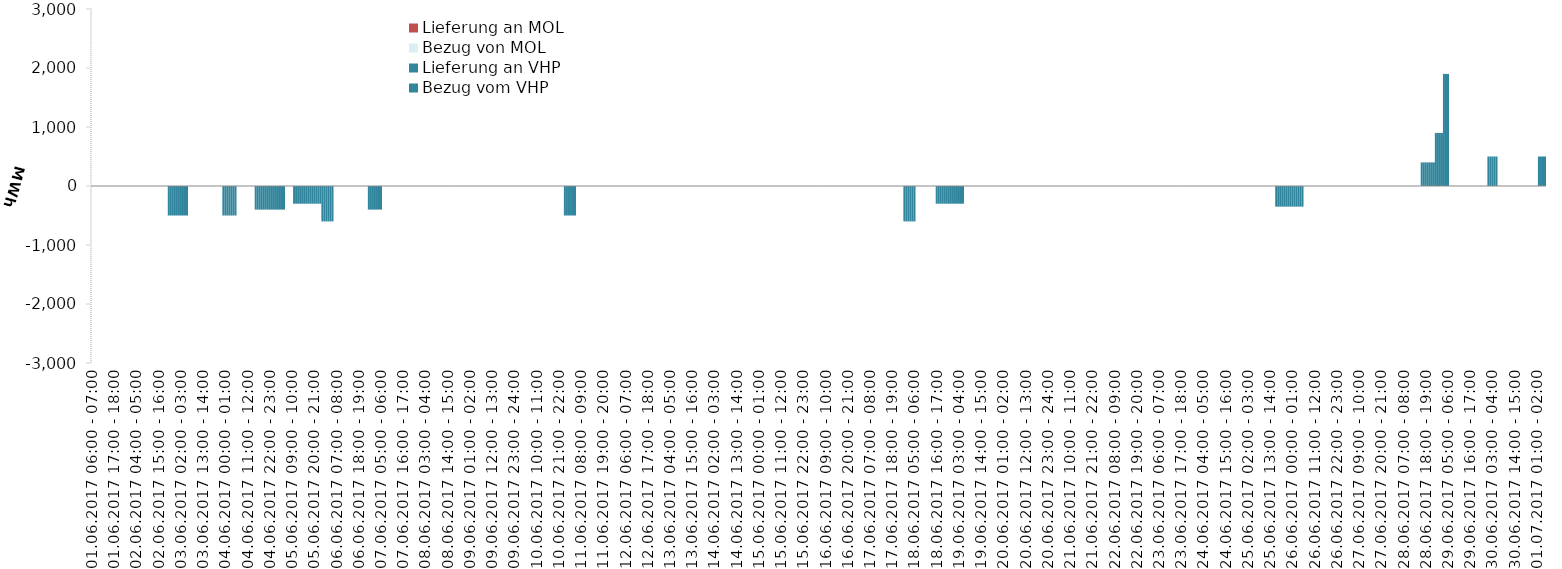
| Category | Bezug vom VHP | Lieferung an VHP | Bezug von MOL | Lieferung an MOL |
|---|---|---|---|---|
| 01.06.2017 06:00 - 07:00 | 0 | 0 | 0 | 0 |
| 01.06.2017 07:00 - 08:00 | 0 | 0 | 0 | 0 |
| 01.06.2017 08:00 - 09:00 | 0 | 0 | 0 | 0 |
| 01.06.2017 09:00 - 10:00 | 0 | 0 | 0 | 0 |
| 01.06.2017 10:00 - 11:00 | 0 | 0 | 0 | 0 |
| 01.06.2017 11:00 - 12:00 | 0 | 0 | 0 | 0 |
| 01.06.2017 12:00 - 13:00 | 0 | 0 | 0 | 0 |
| 01.06.2017 13:00 - 14:00 | 0 | 0 | 0 | 0 |
| 01.06.2017 14:00 - 15:00 | 0 | 0 | 0 | 0 |
| 01.06.2017 15:00 - 16:00 | 0 | 0 | 0 | 0 |
| 01.06.2017 16:00 - 17:00 | 0 | 0 | 0 | 0 |
| 01.06.2017 17:00 - 18:00 | 0 | 0 | 0 | 0 |
| 01.06.2017 18:00 - 19:00 | 0 | 0 | 0 | 0 |
| 01.06.2017 19:00 - 20:00 | 0 | 0 | 0 | 0 |
| 01.06.2017 20:00 - 21:00 | 0 | 0 | 0 | 0 |
| 01.06.2017 21:00 - 22:00 | 0 | 0 | 0 | 0 |
| 01.06.2017 22:00 - 23:00 | 0 | 0 | 0 | 0 |
| 01.06.2017 23:00 - 24:00 | 0 | 0 | 0 | 0 |
| 02.06.2017 00:00 - 01:00 | 0 | 0 | 0 | 0 |
| 02.06.2017 01:00 - 02:00 | 0 | 0 | 0 | 0 |
| 02.06.2017 02:00 - 03:00 | 0 | 0 | 0 | 0 |
| 02.06.2017 03:00 - 04:00 | 0 | 0 | 0 | 0 |
| 02.06.2017 04:00 - 05:00 | 0 | 0 | 0 | 0 |
| 02.06.2017 05:00 - 06:00 | 0 | 0 | 0 | 0 |
| 02.06.2017 06:00 - 07:00 | 0 | 0 | 0 | 0 |
| 02.06.2017 07:00 - 08:00 | 0 | 0 | 0 | 0 |
| 02.06.2017 08:00 - 09:00 | 0 | 0 | 0 | 0 |
| 02.06.2017 09:00 - 10:00 | 0 | 0 | 0 | 0 |
| 02.06.2017 10:00 - 11:00 | 0 | 0 | 0 | 0 |
| 02.06.2017 11:00 - 12:00 | 0 | 0 | 0 | 0 |
| 02.06.2017 12:00 - 13:00 | 0 | 0 | 0 | 0 |
| 02.06.2017 13:00 - 14:00 | 0 | 0 | 0 | 0 |
| 02.06.2017 14:00 - 15:00 | 0 | 0 | 0 | 0 |
| 02.06.2017 15:00 - 16:00 | 0 | 0 | 0 | 0 |
| 02.06.2017 16:00 - 17:00 | 0 | 0 | 0 | 0 |
| 02.06.2017 17:00 - 18:00 | 0 | 0 | 0 | 0 |
| 02.06.2017 18:00 - 19:00 | 0 | 0 | 0 | 0 |
| 02.06.2017 19:00 - 20:00 | 0 | 0 | 0 | 0 |
| 02.06.2017 20:00 - 21:00 | 0 | -500 | 0 | 0 |
| 02.06.2017 21:00 - 22:00 | 0 | -500 | 0 | 0 |
| 02.06.2017 22:00 - 23:00 | 0 | -500 | 0 | 0 |
| 02.06.2017 23:00 - 24:00 | 0 | -500 | 0 | 0 |
| 03.06.2017 00:00 - 01:00 | 0 | -500 | 0 | 0 |
| 03.06.2017 01:00 - 02:00 | 0 | -500 | 0 | 0 |
| 03.06.2017 02:00 - 03:00 | 0 | -500 | 0 | 0 |
| 03.06.2017 03:00 - 04:00 | 0 | -500 | 0 | 0 |
| 03.06.2017 04:00 - 05:00 | 0 | -500 | 0 | 0 |
| 03.06.2017 05:00 - 06:00 | 0 | -500 | 0 | 0 |
| 03.06.2017 06:00 - 07:00 | 0 | 0 | 0 | 0 |
| 03.06.2017 07:00 - 08:00 | 0 | 0 | 0 | 0 |
| 03.06.2017 08:00 - 09:00 | 0 | 0 | 0 | 0 |
| 03.06.2017 09:00 - 10:00 | 0 | 0 | 0 | 0 |
| 03.06.2017 10:00 - 11:00 | 0 | 0 | 0 | 0 |
| 03.06.2017 11:00 - 12:00 | 0 | 0 | 0 | 0 |
| 03.06.2017 12:00 - 13:00 | 0 | 0 | 0 | 0 |
| 03.06.2017 13:00 - 14:00 | 0 | 0 | 0 | 0 |
| 03.06.2017 14:00 - 15:00 | 0 | 0 | 0 | 0 |
| 03.06.2017 15:00 - 16:00 | 0 | 0 | 0 | 0 |
| 03.06.2017 16:00 - 17:00 | 0 | 0 | 0 | 0 |
| 03.06.2017 17:00 - 18:00 | 0 | 0 | 0 | 0 |
| 03.06.2017 18:00 - 19:00 | 0 | 0 | 0 | 0 |
| 03.06.2017 19:00 - 20:00 | 0 | 0 | 0 | 0 |
| 03.06.2017 20:00 - 21:00 | 0 | 0 | 0 | 0 |
| 03.06.2017 21:00 - 22:00 | 0 | 0 | 0 | 0 |
| 03.06.2017 22:00 - 23:00 | 0 | 0 | 0 | 0 |
| 03.06.2017 23:00 - 24:00 | 0 | -500 | 0 | 0 |
| 04.06.2017 00:00 - 01:00 | 0 | -500 | 0 | 0 |
| 04.06.2017 01:00 - 02:00 | 0 | -500 | 0 | 0 |
| 04.06.2017 02:00 - 03:00 | 0 | -500 | 0 | 0 |
| 04.06.2017 03:00 - 04:00 | 0 | -500 | 0 | 0 |
| 04.06.2017 04:00 - 05:00 | 0 | -500 | 0 | 0 |
| 04.06.2017 05:00 - 06:00 | 0 | -500 | 0 | 0 |
| 04.06.2017 06:00 - 07:00 | 0 | 0 | 0 | 0 |
| 04.06.2017 07:00 - 08:00 | 0 | 0 | 0 | 0 |
| 04.06.2017 08:00 - 09:00 | 0 | 0 | 0 | 0 |
| 04.06.2017 09:00 - 10:00 | 0 | 0 | 0 | 0 |
| 04.06.2017 10:00 - 11:00 | 0 | 0 | 0 | 0 |
| 04.06.2017 11:00 - 12:00 | 0 | 0 | 0 | 0 |
| 04.06.2017 12:00 - 13:00 | 0 | 0 | 0 | 0 |
| 04.06.2017 13:00 - 14:00 | 0 | 0 | 0 | 0 |
| 04.06.2017 14:00 - 15:00 | 0 | 0 | 0 | 0 |
| 04.06.2017 15:00 - 16:00 | 0 | -400 | 0 | 0 |
| 04.06.2017 16:00 - 17:00 | 0 | -400 | 0 | 0 |
| 04.06.2017 17:00 - 18:00 | 0 | -400 | 0 | 0 |
| 04.06.2017 18:00 - 19:00 | 0 | -400 | 0 | 0 |
| 04.06.2017 19:00 - 20:00 | 0 | -400 | 0 | 0 |
| 04.06.2017 20:00 - 21:00 | 0 | -400 | 0 | 0 |
| 04.06.2017 21:00 - 22:00 | 0 | -400 | 0 | 0 |
| 04.06.2017 22:00 - 23:00 | 0 | -400 | 0 | 0 |
| 04.06.2017 23:00 - 24:00 | 0 | -400 | 0 | 0 |
| 05.06.2017 00:00 - 01:00 | 0 | -400 | 0 | 0 |
| 05.06.2017 01:00 - 02:00 | 0 | -400 | 0 | 0 |
| 05.06.2017 02:00 - 03:00 | 0 | -400 | 0 | 0 |
| 05.06.2017 03:00 - 04:00 | 0 | -400 | 0 | 0 |
| 05.06.2017 04:00 - 05:00 | 0 | -400 | 0 | 0 |
| 05.06.2017 05:00 - 06:00 | 0 | -400 | 0 | 0 |
| 05.06.2017 06:00 - 07:00 | 0 | 0 | 0 | 0 |
| 05.06.2017 07:00 - 08:00 | 0 | 0 | 0 | 0 |
| 05.06.2017 08:00 - 09:00 | 0 | 0 | 0 | 0 |
| 05.06.2017 09:00 - 10:00 | 0 | 0 | 0 | 0 |
| 05.06.2017 10:00 - 11:00 | 0 | -300 | 0 | 0 |
| 05.06.2017 11:00 - 12:00 | 0 | -300 | 0 | 0 |
| 05.06.2017 12:00 - 13:00 | 0 | -300 | 0 | 0 |
| 05.06.2017 13:00 - 14:00 | 0 | -300 | 0 | 0 |
| 05.06.2017 14:00 - 15:00 | 0 | -300 | 0 | 0 |
| 05.06.2017 15:00 - 16:00 | 0 | -300 | 0 | 0 |
| 05.06.2017 16:00 - 17:00 | 0 | -300 | 0 | 0 |
| 05.06.2017 17:00 - 18:00 | 0 | -300 | 0 | 0 |
| 05.06.2017 18:00 - 19:00 | 0 | -300 | 0 | 0 |
| 05.06.2017 19:00 - 20:00 | 0 | -300 | 0 | 0 |
| 05.06.2017 20:00 - 21:00 | 0 | -300 | 0 | 0 |
| 05.06.2017 21:00 - 22:00 | 0 | -300 | 0 | 0 |
| 05.06.2017 22:00 - 23:00 | 0 | -300 | 0 | 0 |
| 05.06.2017 23:00 - 24:00 | 0 | -300 | 0 | 0 |
| 06.06.2017 00:00 - 01:00 | 0 | -600 | 0 | 0 |
| 06.06.2017 01:00 - 02:00 | 0 | -600 | 0 | 0 |
| 06.06.2017 02:00 - 03:00 | 0 | -600 | 0 | 0 |
| 06.06.2017 03:00 - 04:00 | 0 | -600 | 0 | 0 |
| 06.06.2017 04:00 - 05:00 | 0 | -600 | 0 | 0 |
| 06.06.2017 05:00 - 06:00 | 0 | -600 | 0 | 0 |
| 06.06.2017 06:00 - 07:00 | 0 | 0 | 0 | 0 |
| 06.06.2017 07:00 - 08:00 | 0 | 0 | 0 | 0 |
| 06.06.2017 08:00 - 09:00 | 0 | 0 | 0 | 0 |
| 06.06.2017 09:00 - 10:00 | 0 | 0 | 0 | 0 |
| 06.06.2017 10:00 - 11:00 | 0 | 0 | 0 | 0 |
| 06.06.2017 11:00 - 12:00 | 0 | 0 | 0 | 0 |
| 06.06.2017 12:00 - 13:00 | 0 | 0 | 0 | 0 |
| 06.06.2017 13:00 - 14:00 | 0 | 0 | 0 | 0 |
| 06.06.2017 14:00 - 15:00 | 0 | 0 | 0 | 0 |
| 06.06.2017 15:00 - 16:00 | 0 | 0 | 0 | 0 |
| 06.06.2017 16:00 - 17:00 | 0 | 0 | 0 | 0 |
| 06.06.2017 17:00 - 18:00 | 0 | 0 | 0 | 0 |
| 06.06.2017 18:00 - 19:00 | 0 | 0 | 0 | 0 |
| 06.06.2017 19:00 - 20:00 | 0 | 0 | 0 | 0 |
| 06.06.2017 20:00 - 21:00 | 0 | 0 | 0 | 0 |
| 06.06.2017 21:00 - 22:00 | 0 | 0 | 0 | 0 |
| 06.06.2017 22:00 - 23:00 | 0 | 0 | 0 | 0 |
| 06.06.2017 23:00 - 24:00 | 0 | -400 | 0 | 0 |
| 07.06.2017 00:00 - 01:00 | 0 | -400 | 0 | 0 |
| 07.06.2017 01:00 - 02:00 | 0 | -400 | 0 | 0 |
| 07.06.2017 02:00 - 03:00 | 0 | -400 | 0 | 0 |
| 07.06.2017 03:00 - 04:00 | 0 | -400 | 0 | 0 |
| 07.06.2017 04:00 - 05:00 | 0 | -400 | 0 | 0 |
| 07.06.2017 05:00 - 06:00 | 0 | -400 | 0 | 0 |
| 07.06.2017 06:00 - 07:00 | 0 | 0 | 0 | 0 |
| 07.06.2017 07:00 - 08:00 | 0 | 0 | 0 | 0 |
| 07.06.2017 08:00 - 09:00 | 0 | 0 | 0 | 0 |
| 07.06.2017 09:00 - 10:00 | 0 | 0 | 0 | 0 |
| 07.06.2017 10:00 - 11:00 | 0 | 0 | 0 | 0 |
| 07.06.2017 11:00 - 12:00 | 0 | 0 | 0 | 0 |
| 07.06.2017 12:00 - 13:00 | 0 | 0 | 0 | 0 |
| 07.06.2017 13:00 - 14:00 | 0 | 0 | 0 | 0 |
| 07.06.2017 14:00 - 15:00 | 0 | 0 | 0 | 0 |
| 07.06.2017 15:00 - 16:00 | 0 | 0 | 0 | 0 |
| 07.06.2017 16:00 - 17:00 | 0 | 0 | 0 | 0 |
| 07.06.2017 17:00 - 18:00 | 0 | 0 | 0 | 0 |
| 07.06.2017 18:00 - 19:00 | 0 | 0 | 0 | 0 |
| 07.06.2017 19:00 - 20:00 | 0 | 0 | 0 | 0 |
| 07.06.2017 20:00 - 21:00 | 0 | 0 | 0 | 0 |
| 07.06.2017 21:00 - 22:00 | 0 | 0 | 0 | 0 |
| 07.06.2017 22:00 - 23:00 | 0 | 0 | 0 | 0 |
| 07.06.2017 23:00 - 24:00 | 0 | 0 | 0 | 0 |
| 08.06.2017 00:00 - 01:00 | 0 | 0 | 0 | 0 |
| 08.06.2017 01:00 - 02:00 | 0 | 0 | 0 | 0 |
| 08.06.2017 02:00 - 03:00 | 0 | 0 | 0 | 0 |
| 08.06.2017 03:00 - 04:00 | 0 | 0 | 0 | 0 |
| 08.06.2017 04:00 - 05:00 | 0 | 0 | 0 | 0 |
| 08.06.2017 05:00 - 06:00 | 0 | 0 | 0 | 0 |
| 08.06.2017 06:00 - 07:00 | 0 | 0 | 0 | 0 |
| 08.06.2017 07:00 - 08:00 | 0 | 0 | 0 | 0 |
| 08.06.2017 08:00 - 09:00 | 0 | 0 | 0 | 0 |
| 08.06.2017 09:00 - 10:00 | 0 | 0 | 0 | 0 |
| 08.06.2017 10:00 - 11:00 | 0 | 0 | 0 | 0 |
| 08.06.2017 11:00 - 12:00 | 0 | 0 | 0 | 0 |
| 08.06.2017 12:00 - 13:00 | 0 | 0 | 0 | 0 |
| 08.06.2017 13:00 - 14:00 | 0 | 0 | 0 | 0 |
| 08.06.2017 14:00 - 15:00 | 0 | 0 | 0 | 0 |
| 08.06.2017 15:00 - 16:00 | 0 | 0 | 0 | 0 |
| 08.06.2017 16:00 - 17:00 | 0 | 0 | 0 | 0 |
| 08.06.2017 17:00 - 18:00 | 0 | 0 | 0 | 0 |
| 08.06.2017 18:00 - 19:00 | 0 | 0 | 0 | 0 |
| 08.06.2017 19:00 - 20:00 | 0 | 0 | 0 | 0 |
| 08.06.2017 20:00 - 21:00 | 0 | 0 | 0 | 0 |
| 08.06.2017 21:00 - 22:00 | 0 | 0 | 0 | 0 |
| 08.06.2017 22:00 - 23:00 | 0 | 0 | 0 | 0 |
| 08.06.2017 23:00 - 24:00 | 0 | 0 | 0 | 0 |
| 09.06.2017 00:00 - 01:00 | 0 | 0 | 0 | 0 |
| 09.06.2017 01:00 - 02:00 | 0 | 0 | 0 | 0 |
| 09.06.2017 02:00 - 03:00 | 0 | 0 | 0 | 0 |
| 09.06.2017 03:00 - 04:00 | 0 | 0 | 0 | 0 |
| 09.06.2017 04:00 - 05:00 | 0 | 0 | 0 | 0 |
| 09.06.2017 05:00 - 06:00 | 0 | 0 | 0 | 0 |
| 09.06.2017 06:00 - 07:00 | 0 | 0 | 0 | 0 |
| 09.06.2017 07:00 - 08:00 | 0 | 0 | 0 | 0 |
| 09.06.2017 08:00 - 09:00 | 0 | 0 | 0 | 0 |
| 09.06.2017 09:00 - 10:00 | 0 | 0 | 0 | 0 |
| 09.06.2017 10:00 - 11:00 | 0 | 0 | 0 | 0 |
| 09.06.2017 11:00 - 12:00 | 0 | 0 | 0 | 0 |
| 09.06.2017 12:00 - 13:00 | 0 | 0 | 0 | 0 |
| 09.06.2017 13:00 - 14:00 | 0 | 0 | 0 | 0 |
| 09.06.2017 14:00 - 15:00 | 0 | 0 | 0 | 0 |
| 09.06.2017 15:00 - 16:00 | 0 | 0 | 0 | 0 |
| 09.06.2017 16:00 - 17:00 | 0 | 0 | 0 | 0 |
| 09.06.2017 17:00 - 18:00 | 0 | 0 | 0 | 0 |
| 09.06.2017 18:00 - 19:00 | 0 | 0 | 0 | 0 |
| 09.06.2017 19:00 - 20:00 | 0 | 0 | 0 | 0 |
| 09.06.2017 20:00 - 21:00 | 0 | 0 | 0 | 0 |
| 09.06.2017 21:00 - 22:00 | 0 | 0 | 0 | 0 |
| 09.06.2017 22:00 - 23:00 | 0 | 0 | 0 | 0 |
| 09.06.2017 23:00 - 24:00 | 0 | 0 | 0 | 0 |
| 10.06.2017 00:00 - 01:00 | 0 | 0 | 0 | 0 |
| 10.06.2017 01:00 - 02:00 | 0 | 0 | 0 | 0 |
| 10.06.2017 02:00 - 03:00 | 0 | 0 | 0 | 0 |
| 10.06.2017 03:00 - 04:00 | 0 | 0 | 0 | 0 |
| 10.06.2017 04:00 - 05:00 | 0 | 0 | 0 | 0 |
| 10.06.2017 05:00 - 06:00 | 0 | 0 | 0 | 0 |
| 10.06.2017 06:00 - 07:00 | 0 | 0 | 0 | 0 |
| 10.06.2017 07:00 - 08:00 | 0 | 0 | 0 | 0 |
| 10.06.2017 08:00 - 09:00 | 0 | 0 | 0 | 0 |
| 10.06.2017 09:00 - 10:00 | 0 | 0 | 0 | 0 |
| 10.06.2017 10:00 - 11:00 | 0 | 0 | 0 | 0 |
| 10.06.2017 11:00 - 12:00 | 0 | 0 | 0 | 0 |
| 10.06.2017 12:00 - 13:00 | 0 | 0 | 0 | 0 |
| 10.06.2017 13:00 - 14:00 | 0 | 0 | 0 | 0 |
| 10.06.2017 14:00 - 15:00 | 0 | 0 | 0 | 0 |
| 10.06.2017 15:00 - 16:00 | 0 | 0 | 0 | 0 |
| 10.06.2017 16:00 - 17:00 | 0 | 0 | 0 | 0 |
| 10.06.2017 17:00 - 18:00 | 0 | 0 | 0 | 0 |
| 10.06.2017 18:00 - 19:00 | 0 | 0 | 0 | 0 |
| 10.06.2017 19:00 - 20:00 | 0 | 0 | 0 | 0 |
| 10.06.2017 20:00 - 21:00 | 0 | 0 | 0 | 0 |
| 10.06.2017 21:00 - 22:00 | 0 | 0 | 0 | 0 |
| 10.06.2017 22:00 - 23:00 | 0 | 0 | 0 | 0 |
| 10.06.2017 23:00 - 24:00 | 0 | 0 | 0 | 0 |
| 11.06.2017 00:00 - 01:00 | 0 | -500 | 0 | 0 |
| 11.06.2017 01:00 - 02:00 | 0 | -500 | 0 | 0 |
| 11.06.2017 02:00 - 03:00 | 0 | -500 | 0 | 0 |
| 11.06.2017 03:00 - 04:00 | 0 | -500 | 0 | 0 |
| 11.06.2017 04:00 - 05:00 | 0 | -500 | 0 | 0 |
| 11.06.2017 05:00 - 06:00 | 0 | -500 | 0 | 0 |
| 11.06.2017 06:00 - 07:00 | 0 | 0 | 0 | 0 |
| 11.06.2017 07:00 - 08:00 | 0 | 0 | 0 | 0 |
| 11.06.2017 08:00 - 09:00 | 0 | 0 | 0 | 0 |
| 11.06.2017 09:00 - 10:00 | 0 | 0 | 0 | 0 |
| 11.06.2017 10:00 - 11:00 | 0 | 0 | 0 | 0 |
| 11.06.2017 11:00 - 12:00 | 0 | 0 | 0 | 0 |
| 11.06.2017 12:00 - 13:00 | 0 | 0 | 0 | 0 |
| 11.06.2017 13:00 - 14:00 | 0 | 0 | 0 | 0 |
| 11.06.2017 14:00 - 15:00 | 0 | 0 | 0 | 0 |
| 11.06.2017 15:00 - 16:00 | 0 | 0 | 0 | 0 |
| 11.06.2017 16:00 - 17:00 | 0 | 0 | 0 | 0 |
| 11.06.2017 17:00 - 18:00 | 0 | 0 | 0 | 0 |
| 11.06.2017 18:00 - 19:00 | 0 | 0 | 0 | 0 |
| 11.06.2017 19:00 - 20:00 | 0 | 0 | 0 | 0 |
| 11.06.2017 20:00 - 21:00 | 0 | 0 | 0 | 0 |
| 11.06.2017 21:00 - 22:00 | 0 | 0 | 0 | 0 |
| 11.06.2017 22:00 - 23:00 | 0 | 0 | 0 | 0 |
| 11.06.2017 23:00 - 24:00 | 0 | 0 | 0 | 0 |
| 12.06.2017 00:00 - 01:00 | 0 | 0 | 0 | 0 |
| 12.06.2017 01:00 - 02:00 | 0 | 0 | 0 | 0 |
| 12.06.2017 02:00 - 03:00 | 0 | 0 | 0 | 0 |
| 12.06.2017 03:00 - 04:00 | 0 | 0 | 0 | 0 |
| 12.06.2017 04:00 - 05:00 | 0 | 0 | 0 | 0 |
| 12.06.2017 05:00 - 06:00 | 0 | 0 | 0 | 0 |
| 12.06.2017 06:00 - 07:00 | 0 | 0 | 0 | 0 |
| 12.06.2017 07:00 - 08:00 | 0 | 0 | 0 | 0 |
| 12.06.2017 08:00 - 09:00 | 0 | 0 | 0 | 0 |
| 12.06.2017 09:00 - 10:00 | 0 | 0 | 0 | 0 |
| 12.06.2017 10:00 - 11:00 | 0 | 0 | 0 | 0 |
| 12.06.2017 11:00 - 12:00 | 0 | 0 | 0 | 0 |
| 12.06.2017 12:00 - 13:00 | 0 | 0 | 0 | 0 |
| 12.06.2017 13:00 - 14:00 | 0 | 0 | 0 | 0 |
| 12.06.2017 14:00 - 15:00 | 0 | 0 | 0 | 0 |
| 12.06.2017 15:00 - 16:00 | 0 | 0 | 0 | 0 |
| 12.06.2017 16:00 - 17:00 | 0 | 0 | 0 | 0 |
| 12.06.2017 17:00 - 18:00 | 0 | 0 | 0 | 0 |
| 12.06.2017 18:00 - 19:00 | 0 | 0 | 0 | 0 |
| 12.06.2017 19:00 - 20:00 | 0 | 0 | 0 | 0 |
| 12.06.2017 20:00 - 21:00 | 0 | 0 | 0 | 0 |
| 12.06.2017 21:00 - 22:00 | 0 | 0 | 0 | 0 |
| 12.06.2017 22:00 - 23:00 | 0 | 0 | 0 | 0 |
| 12.06.2017 23:00 - 24:00 | 0 | 0 | 0 | 0 |
| 13.06.2017 00:00 - 01:00 | 0 | 0 | 0 | 0 |
| 13.06.2017 01:00 - 02:00 | 0 | 0 | 0 | 0 |
| 13.06.2017 02:00 - 03:00 | 0 | 0 | 0 | 0 |
| 13.06.2017 03:00 - 04:00 | 0 | 0 | 0 | 0 |
| 13.06.2017 04:00 - 05:00 | 0 | 0 | 0 | 0 |
| 13.06.2017 05:00 - 06:00 | 0 | 0 | 0 | 0 |
| 13.06.2017 06:00 - 07:00 | 0 | 0 | 0 | 0 |
| 13.06.2017 07:00 - 08:00 | 0 | 0 | 0 | 0 |
| 13.06.2017 08:00 - 09:00 | 0 | 0 | 0 | 0 |
| 13.06.2017 09:00 - 10:00 | 0 | 0 | 0 | 0 |
| 13.06.2017 10:00 - 11:00 | 0 | 0 | 0 | 0 |
| 13.06.2017 11:00 - 12:00 | 0 | 0 | 0 | 0 |
| 13.06.2017 12:00 - 13:00 | 0 | 0 | 0 | 0 |
| 13.06.2017 13:00 - 14:00 | 0 | 0 | 0 | 0 |
| 13.06.2017 14:00 - 15:00 | 0 | 0 | 0 | 0 |
| 13.06.2017 15:00 - 16:00 | 0 | 0 | 0 | 0 |
| 13.06.2017 16:00 - 17:00 | 0 | 0 | 0 | 0 |
| 13.06.2017 17:00 - 18:00 | 0 | 0 | 0 | 0 |
| 13.06.2017 18:00 - 19:00 | 0 | 0 | 0 | 0 |
| 13.06.2017 19:00 - 20:00 | 0 | 0 | 0 | 0 |
| 13.06.2017 20:00 - 21:00 | 0 | 0 | 0 | 0 |
| 13.06.2017 21:00 - 22:00 | 0 | 0 | 0 | 0 |
| 13.06.2017 22:00 - 23:00 | 0 | 0 | 0 | 0 |
| 13.06.2017 23:00 - 24:00 | 0 | 0 | 0 | 0 |
| 14.06.2017 00:00 - 01:00 | 0 | 0 | 0 | 0 |
| 14.06.2017 01:00 - 02:00 | 0 | 0 | 0 | 0 |
| 14.06.2017 02:00 - 03:00 | 0 | 0 | 0 | 0 |
| 14.06.2017 03:00 - 04:00 | 0 | 0 | 0 | 0 |
| 14.06.2017 04:00 - 05:00 | 0 | 0 | 0 | 0 |
| 14.06.2017 05:00 - 06:00 | 0 | 0 | 0 | 0 |
| 14.06.2017 06:00 - 07:00 | 0 | 0 | 0 | 0 |
| 14.06.2017 07:00 - 08:00 | 0 | 0 | 0 | 0 |
| 14.06.2017 08:00 - 09:00 | 0 | 0 | 0 | 0 |
| 14.06.2017 09:00 - 10:00 | 0 | 0 | 0 | 0 |
| 14.06.2017 10:00 - 11:00 | 0 | 0 | 0 | 0 |
| 14.06.2017 11:00 - 12:00 | 0 | 0 | 0 | 0 |
| 14.06.2017 12:00 - 13:00 | 0 | 0 | 0 | 0 |
| 14.06.2017 13:00 - 14:00 | 0 | 0 | 0 | 0 |
| 14.06.2017 14:00 - 15:00 | 0 | 0 | 0 | 0 |
| 14.06.2017 15:00 - 16:00 | 0 | 0 | 0 | 0 |
| 14.06.2017 16:00 - 17:00 | 0 | 0 | 0 | 0 |
| 14.06.2017 17:00 - 18:00 | 0 | 0 | 0 | 0 |
| 14.06.2017 18:00 - 19:00 | 0 | 0 | 0 | 0 |
| 14.06.2017 19:00 - 20:00 | 0 | 0 | 0 | 0 |
| 14.06.2017 20:00 - 21:00 | 0 | 0 | 0 | 0 |
| 14.06.2017 21:00 - 22:00 | 0 | 0 | 0 | 0 |
| 14.06.2017 22:00 - 23:00 | 0 | 0 | 0 | 0 |
| 14.06.2017 23:00 - 24:00 | 0 | 0 | 0 | 0 |
| 15.06.2017 00:00 - 01:00 | 0 | 0 | 0 | 0 |
| 15.06.2017 01:00 - 02:00 | 0 | 0 | 0 | 0 |
| 15.06.2017 02:00 - 03:00 | 0 | 0 | 0 | 0 |
| 15.06.2017 03:00 - 04:00 | 0 | 0 | 0 | 0 |
| 15.06.2017 04:00 - 05:00 | 0 | 0 | 0 | 0 |
| 15.06.2017 05:00 - 06:00 | 0 | 0 | 0 | 0 |
| 15.06.2017 06:00 - 07:00 | 0 | 0 | 0 | 0 |
| 15.06.2017 07:00 - 08:00 | 0 | 0 | 0 | 0 |
| 15.06.2017 08:00 - 09:00 | 0 | 0 | 0 | 0 |
| 15.06.2017 09:00 - 10:00 | 0 | 0 | 0 | 0 |
| 15.06.2017 10:00 - 11:00 | 0 | 0 | 0 | 0 |
| 15.06.2017 11:00 - 12:00 | 0 | 0 | 0 | 0 |
| 15.06.2017 12:00 - 13:00 | 0 | 0 | 0 | 0 |
| 15.06.2017 13:00 - 14:00 | 0 | 0 | 0 | 0 |
| 15.06.2017 14:00 - 15:00 | 0 | 0 | 0 | 0 |
| 15.06.2017 15:00 - 16:00 | 0 | 0 | 0 | 0 |
| 15.06.2017 16:00 - 17:00 | 0 | 0 | 0 | 0 |
| 15.06.2017 17:00 - 18:00 | 0 | 0 | 0 | 0 |
| 15.06.2017 18:00 - 19:00 | 0 | 0 | 0 | 0 |
| 15.06.2017 19:00 - 20:00 | 0 | 0 | 0 | 0 |
| 15.06.2017 20:00 - 21:00 | 0 | 0 | 0 | 0 |
| 15.06.2017 21:00 - 22:00 | 0 | 0 | 0 | 0 |
| 15.06.2017 22:00 - 23:00 | 0 | 0 | 0 | 0 |
| 15.06.2017 23:00 - 24:00 | 0 | 0 | 0 | 0 |
| 16.06.2017 00:00 - 01:00 | 0 | 0 | 0 | 0 |
| 16.06.2017 01:00 - 02:00 | 0 | 0 | 0 | 0 |
| 16.06.2017 02:00 - 03:00 | 0 | 0 | 0 | 0 |
| 16.06.2017 03:00 - 04:00 | 0 | 0 | 0 | 0 |
| 16.06.2017 04:00 - 05:00 | 0 | 0 | 0 | 0 |
| 16.06.2017 05:00 - 06:00 | 0 | 0 | 0 | 0 |
| 16.06.2017 06:00 - 07:00 | 0 | 0 | 0 | 0 |
| 16.06.2017 07:00 - 08:00 | 0 | 0 | 0 | 0 |
| 16.06.2017 08:00 - 09:00 | 0 | 0 | 0 | 0 |
| 16.06.2017 09:00 - 10:00 | 0 | 0 | 0 | 0 |
| 16.06.2017 10:00 - 11:00 | 0 | 0 | 0 | 0 |
| 16.06.2017 11:00 - 12:00 | 0 | 0 | 0 | 0 |
| 16.06.2017 12:00 - 13:00 | 0 | 0 | 0 | 0 |
| 16.06.2017 13:00 - 14:00 | 0 | 0 | 0 | 0 |
| 16.06.2017 14:00 - 15:00 | 0 | 0 | 0 | 0 |
| 16.06.2017 15:00 - 16:00 | 0 | 0 | 0 | 0 |
| 16.06.2017 16:00 - 17:00 | 0 | 0 | 0 | 0 |
| 16.06.2017 17:00 - 18:00 | 0 | 0 | 0 | 0 |
| 16.06.2017 18:00 - 19:00 | 0 | 0 | 0 | 0 |
| 16.06.2017 19:00 - 20:00 | 0 | 0 | 0 | 0 |
| 16.06.2017 20:00 - 21:00 | 0 | 0 | 0 | 0 |
| 16.06.2017 21:00 - 22:00 | 0 | 0 | 0 | 0 |
| 16.06.2017 22:00 - 23:00 | 0 | 0 | 0 | 0 |
| 16.06.2017 23:00 - 24:00 | 0 | 0 | 0 | 0 |
| 17.06.2017 00:00 - 01:00 | 0 | 0 | 0 | 0 |
| 17.06.2017 01:00 - 02:00 | 0 | 0 | 0 | 0 |
| 17.06.2017 02:00 - 03:00 | 0 | 0 | 0 | 0 |
| 17.06.2017 03:00 - 04:00 | 0 | 0 | 0 | 0 |
| 17.06.2017 04:00 - 05:00 | 0 | 0 | 0 | 0 |
| 17.06.2017 05:00 - 06:00 | 0 | 0 | 0 | 0 |
| 17.06.2017 06:00 - 07:00 | 0 | 0 | 0 | 0 |
| 17.06.2017 07:00 - 08:00 | 0 | 0 | 0 | 0 |
| 17.06.2017 08:00 - 09:00 | 0 | 0 | 0 | 0 |
| 17.06.2017 09:00 - 10:00 | 0 | 0 | 0 | 0 |
| 17.06.2017 10:00 - 11:00 | 0 | 0 | 0 | 0 |
| 17.06.2017 11:00 - 12:00 | 0 | 0 | 0 | 0 |
| 17.06.2017 12:00 - 13:00 | 0 | 0 | 0 | 0 |
| 17.06.2017 13:00 - 14:00 | 0 | 0 | 0 | 0 |
| 17.06.2017 14:00 - 15:00 | 0 | 0 | 0 | 0 |
| 17.06.2017 15:00 - 16:00 | 0 | 0 | 0 | 0 |
| 17.06.2017 16:00 - 17:00 | 0 | 0 | 0 | 0 |
| 17.06.2017 17:00 - 18:00 | 0 | 0 | 0 | 0 |
| 17.06.2017 18:00 - 19:00 | 0 | 0 | 0 | 0 |
| 17.06.2017 19:00 - 20:00 | 0 | 0 | 0 | 0 |
| 17.06.2017 20:00 - 21:00 | 0 | 0 | 0 | 0 |
| 17.06.2017 21:00 - 22:00 | 0 | 0 | 0 | 0 |
| 17.06.2017 22:00 - 23:00 | 0 | 0 | 0 | 0 |
| 17.06.2017 23:00 - 24:00 | 0 | 0 | 0 | 0 |
| 18.06.2017 00:00 - 01:00 | 0 | -600 | 0 | 0 |
| 18.06.2017 01:00 - 02:00 | 0 | -600 | 0 | 0 |
| 18.06.2017 02:00 - 03:00 | 0 | -600 | 0 | 0 |
| 18.06.2017 03:00 - 04:00 | 0 | -600 | 0 | 0 |
| 18.06.2017 04:00 - 05:00 | 0 | -600 | 0 | 0 |
| 18.06.2017 05:00 - 06:00 | 0 | -600 | 0 | 0 |
| 18.06.2017 06:00 - 07:00 | 0 | 0 | 0 | 0 |
| 18.06.2017 07:00 - 08:00 | 0 | 0 | 0 | 0 |
| 18.06.2017 08:00 - 09:00 | 0 | 0 | 0 | 0 |
| 18.06.2017 09:00 - 10:00 | 0 | 0 | 0 | 0 |
| 18.06.2017 10:00 - 11:00 | 0 | 0 | 0 | 0 |
| 18.06.2017 11:00 - 12:00 | 0 | 0 | 0 | 0 |
| 18.06.2017 12:00 - 13:00 | 0 | 0 | 0 | 0 |
| 18.06.2017 13:00 - 14:00 | 0 | 0 | 0 | 0 |
| 18.06.2017 14:00 - 15:00 | 0 | 0 | 0 | 0 |
| 18.06.2017 15:00 - 16:00 | 0 | 0 | 0 | 0 |
| 18.06.2017 16:00 - 17:00 | 0 | -300 | 0 | 0 |
| 18.06.2017 17:00 - 18:00 | 0 | -300 | 0 | 0 |
| 18.06.2017 18:00 - 19:00 | 0 | -300 | 0 | 0 |
| 18.06.2017 19:00 - 20:00 | 0 | -300 | 0 | 0 |
| 18.06.2017 20:00 - 21:00 | 0 | -300 | 0 | 0 |
| 18.06.2017 21:00 - 22:00 | 0 | -300 | 0 | 0 |
| 18.06.2017 22:00 - 23:00 | 0 | -300 | 0 | 0 |
| 18.06.2017 23:00 - 24:00 | 0 | -300 | 0 | 0 |
| 19.06.2017 00:00 - 01:00 | 0 | -300 | 0 | 0 |
| 19.06.2017 01:00 - 02:00 | 0 | -300 | 0 | 0 |
| 19.06.2017 02:00 - 03:00 | 0 | -300 | 0 | 0 |
| 19.06.2017 03:00 - 04:00 | 0 | -300 | 0 | 0 |
| 19.06.2017 04:00 - 05:00 | 0 | -300 | 0 | 0 |
| 19.06.2017 05:00 - 06:00 | 0 | -300 | 0 | 0 |
| 19.06.2017 06:00 - 07:00 | 0 | 0 | 0 | 0 |
| 19.06.2017 07:00 - 08:00 | 0 | 0 | 0 | 0 |
| 19.06.2017 08:00 - 09:00 | 0 | 0 | 0 | 0 |
| 19.06.2017 09:00 - 10:00 | 0 | 0 | 0 | 0 |
| 19.06.2017 10:00 - 11:00 | 0 | 0 | 0 | 0 |
| 19.06.2017 11:00 - 12:00 | 0 | 0 | 0 | 0 |
| 19.06.2017 12:00 - 13:00 | 0 | 0 | 0 | 0 |
| 19.06.2017 13:00 - 14:00 | 0 | 0 | 0 | 0 |
| 19.06.2017 14:00 - 15:00 | 0 | 0 | 0 | 0 |
| 19.06.2017 15:00 - 16:00 | 0 | 0 | 0 | 0 |
| 19.06.2017 16:00 - 17:00 | 0 | 0 | 0 | 0 |
| 19.06.2017 17:00 - 18:00 | 0 | 0 | 0 | 0 |
| 19.06.2017 18:00 - 19:00 | 0 | 0 | 0 | 0 |
| 19.06.2017 19:00 - 20:00 | 0 | 0 | 0 | 0 |
| 19.06.2017 20:00 - 21:00 | 0 | 0 | 0 | 0 |
| 19.06.2017 21:00 - 22:00 | 0 | 0 | 0 | 0 |
| 19.06.2017 22:00 - 23:00 | 0 | 0 | 0 | 0 |
| 19.06.2017 23:00 - 24:00 | 0 | 0 | 0 | 0 |
| 20.06.2017 00:00 - 01:00 | 0 | 0 | 0 | 0 |
| 20.06.2017 01:00 - 02:00 | 0 | 0 | 0 | 0 |
| 20.06.2017 02:00 - 03:00 | 0 | 0 | 0 | 0 |
| 20.06.2017 03:00 - 04:00 | 0 | 0 | 0 | 0 |
| 20.06.2017 04:00 - 05:00 | 0 | 0 | 0 | 0 |
| 20.06.2017 05:00 - 06:00 | 0 | 0 | 0 | 0 |
| 20.06.2017 06:00 - 07:00 | 0 | 0 | 0 | 0 |
| 20.06.2017 07:00 - 08:00 | 0 | 0 | 0 | 0 |
| 20.06.2017 08:00 - 09:00 | 0 | 0 | 0 | 0 |
| 20.06.2017 09:00 - 10:00 | 0 | 0 | 0 | 0 |
| 20.06.2017 10:00 - 11:00 | 0 | 0 | 0 | 0 |
| 20.06.2017 11:00 - 12:00 | 0 | 0 | 0 | 0 |
| 20.06.2017 12:00 - 13:00 | 0 | 0 | 0 | 0 |
| 20.06.2017 13:00 - 14:00 | 0 | 0 | 0 | 0 |
| 20.06.2017 14:00 - 15:00 | 0 | 0 | 0 | 0 |
| 20.06.2017 15:00 - 16:00 | 0 | 0 | 0 | 0 |
| 20.06.2017 16:00 - 17:00 | 0 | 0 | 0 | 0 |
| 20.06.2017 17:00 - 18:00 | 0 | 0 | 0 | 0 |
| 20.06.2017 18:00 - 19:00 | 0 | 0 | 0 | 0 |
| 20.06.2017 19:00 - 20:00 | 0 | 0 | 0 | 0 |
| 20.06.2017 20:00 - 21:00 | 0 | 0 | 0 | 0 |
| 20.06.2017 21:00 - 22:00 | 0 | 0 | 0 | 0 |
| 20.06.2017 22:00 - 23:00 | 0 | 0 | 0 | 0 |
| 20.06.2017 23:00 - 24:00 | 0 | 0 | 0 | 0 |
| 21.06.2017 00:00 - 01:00 | 0 | 0 | 0 | 0 |
| 21.06.2017 01:00 - 02:00 | 0 | 0 | 0 | 0 |
| 21.06.2017 02:00 - 03:00 | 0 | 0 | 0 | 0 |
| 21.06.2017 03:00 - 04:00 | 0 | 0 | 0 | 0 |
| 21.06.2017 04:00 - 05:00 | 0 | 0 | 0 | 0 |
| 21.06.2017 05:00 - 06:00 | 0 | 0 | 0 | 0 |
| 21.06.2017 06:00 - 07:00 | 0 | 0 | 0 | 0 |
| 21.06.2017 07:00 - 08:00 | 0 | 0 | 0 | 0 |
| 21.06.2017 08:00 - 09:00 | 0 | 0 | 0 | 0 |
| 21.06.2017 09:00 - 10:00 | 0 | 0 | 0 | 0 |
| 21.06.2017 10:00 - 11:00 | 0 | 0 | 0 | 0 |
| 21.06.2017 11:00 - 12:00 | 0 | 0 | 0 | 0 |
| 21.06.2017 12:00 - 13:00 | 0 | 0 | 0 | 0 |
| 21.06.2017 13:00 - 14:00 | 0 | 0 | 0 | 0 |
| 21.06.2017 14:00 - 15:00 | 0 | 0 | 0 | 0 |
| 21.06.2017 15:00 - 16:00 | 0 | 0 | 0 | 0 |
| 21.06.2017 16:00 - 17:00 | 0 | 0 | 0 | 0 |
| 21.06.2017 17:00 - 18:00 | 0 | 0 | 0 | 0 |
| 21.06.2017 18:00 - 19:00 | 0 | 0 | 0 | 0 |
| 21.06.2017 19:00 - 20:00 | 0 | 0 | 0 | 0 |
| 21.06.2017 20:00 - 21:00 | 0 | 0 | 0 | 0 |
| 21.06.2017 21:00 - 22:00 | 0 | 0 | 0 | 0 |
| 21.06.2017 22:00 - 23:00 | 0 | 0 | 0 | 0 |
| 21.06.2017 23:00 - 24:00 | 0 | 0 | 0 | 0 |
| 22.06.2017 00:00 - 01:00 | 0 | 0 | 0 | 0 |
| 22.06.2017 01:00 - 02:00 | 0 | 0 | 0 | 0 |
| 22.06.2017 02:00 - 03:00 | 0 | 0 | 0 | 0 |
| 22.06.2017 03:00 - 04:00 | 0 | 0 | 0 | 0 |
| 22.06.2017 04:00 - 05:00 | 0 | 0 | 0 | 0 |
| 22.06.2017 05:00 - 06:00 | 0 | 0 | 0 | 0 |
| 22.06.2017 06:00 - 07:00 | 0 | 0 | 0 | 0 |
| 22.06.2017 07:00 - 08:00 | 0 | 0 | 0 | 0 |
| 22.06.2017 08:00 - 09:00 | 0 | 0 | 0 | 0 |
| 22.06.2017 09:00 - 10:00 | 0 | 0 | 0 | 0 |
| 22.06.2017 10:00 - 11:00 | 0 | 0 | 0 | 0 |
| 22.06.2017 11:00 - 12:00 | 0 | 0 | 0 | 0 |
| 22.06.2017 12:00 - 13:00 | 0 | 0 | 0 | 0 |
| 22.06.2017 13:00 - 14:00 | 0 | 0 | 0 | 0 |
| 22.06.2017 14:00 - 15:00 | 0 | 0 | 0 | 0 |
| 22.06.2017 15:00 - 16:00 | 0 | 0 | 0 | 0 |
| 22.06.2017 16:00 - 17:00 | 0 | 0 | 0 | 0 |
| 22.06.2017 17:00 - 18:00 | 0 | 0 | 0 | 0 |
| 22.06.2017 18:00 - 19:00 | 0 | 0 | 0 | 0 |
| 22.06.2017 19:00 - 20:00 | 0 | 0 | 0 | 0 |
| 22.06.2017 20:00 - 21:00 | 0 | 0 | 0 | 0 |
| 22.06.2017 21:00 - 22:00 | 0 | 0 | 0 | 0 |
| 22.06.2017 22:00 - 23:00 | 0 | 0 | 0 | 0 |
| 22.06.2017 23:00 - 24:00 | 0 | 0 | 0 | 0 |
| 23.06.2017 00:00 - 01:00 | 0 | 0 | 0 | 0 |
| 23.06.2017 01:00 - 02:00 | 0 | 0 | 0 | 0 |
| 23.06.2017 02:00 - 03:00 | 0 | 0 | 0 | 0 |
| 23.06.2017 03:00 - 04:00 | 0 | 0 | 0 | 0 |
| 23.06.2017 04:00 - 05:00 | 0 | 0 | 0 | 0 |
| 23.06.2017 05:00 - 06:00 | 0 | 0 | 0 | 0 |
| 23.06.2017 06:00 - 07:00 | 0 | 0 | 0 | 0 |
| 23.06.2017 07:00 - 08:00 | 0 | 0 | 0 | 0 |
| 23.06.2017 08:00 - 09:00 | 0 | 0 | 0 | 0 |
| 23.06.2017 09:00 - 10:00 | 0 | 0 | 0 | 0 |
| 23.06.2017 10:00 - 11:00 | 0 | 0 | 0 | 0 |
| 23.06.2017 11:00 - 12:00 | 0 | 0 | 0 | 0 |
| 23.06.2017 12:00 - 13:00 | 0 | 0 | 0 | 0 |
| 23.06.2017 13:00 - 14:00 | 0 | 0 | 0 | 0 |
| 23.06.2017 14:00 - 15:00 | 0 | 0 | 0 | 0 |
| 23.06.2017 15:00 - 16:00 | 0 | 0 | 0 | 0 |
| 23.06.2017 16:00 - 17:00 | 0 | 0 | 0 | 0 |
| 23.06.2017 17:00 - 18:00 | 0 | 0 | 0 | 0 |
| 23.06.2017 18:00 - 19:00 | 0 | 0 | 0 | 0 |
| 23.06.2017 19:00 - 20:00 | 0 | 0 | 0 | 0 |
| 23.06.2017 20:00 - 21:00 | 0 | 0 | 0 | 0 |
| 23.06.2017 21:00 - 22:00 | 0 | 0 | 0 | 0 |
| 23.06.2017 22:00 - 23:00 | 0 | 0 | 0 | 0 |
| 23.06.2017 23:00 - 24:00 | 0 | 0 | 0 | 0 |
| 24.06.2017 00:00 - 01:00 | 0 | 0 | 0 | 0 |
| 24.06.2017 01:00 - 02:00 | 0 | 0 | 0 | 0 |
| 24.06.2017 02:00 - 03:00 | 0 | 0 | 0 | 0 |
| 24.06.2017 03:00 - 04:00 | 0 | 0 | 0 | 0 |
| 24.06.2017 04:00 - 05:00 | 0 | 0 | 0 | 0 |
| 24.06.2017 05:00 - 06:00 | 0 | 0 | 0 | 0 |
| 24.06.2017 06:00 - 07:00 | 0 | 0 | 0 | 0 |
| 24.06.2017 07:00 - 08:00 | 0 | 0 | 0 | 0 |
| 24.06.2017 08:00 - 09:00 | 0 | 0 | 0 | 0 |
| 24.06.2017 09:00 - 10:00 | 0 | 0 | 0 | 0 |
| 24.06.2017 10:00 - 11:00 | 0 | 0 | 0 | 0 |
| 24.06.2017 11:00 - 12:00 | 0 | 0 | 0 | 0 |
| 24.06.2017 12:00 - 13:00 | 0 | 0 | 0 | 0 |
| 24.06.2017 13:00 - 14:00 | 0 | 0 | 0 | 0 |
| 24.06.2017 14:00 - 15:00 | 0 | 0 | 0 | 0 |
| 24.06.2017 15:00 - 16:00 | 0 | 0 | 0 | 0 |
| 24.06.2017 16:00 - 17:00 | 0 | 0 | 0 | 0 |
| 24.06.2017 17:00 - 18:00 | 0 | 0 | 0 | 0 |
| 24.06.2017 18:00 - 19:00 | 0 | 0 | 0 | 0 |
| 24.06.2017 19:00 - 20:00 | 0 | 0 | 0 | 0 |
| 24.06.2017 20:00 - 21:00 | 0 | 0 | 0 | 0 |
| 24.06.2017 21:00 - 22:00 | 0 | 0 | 0 | 0 |
| 24.06.2017 22:00 - 23:00 | 0 | 0 | 0 | 0 |
| 24.06.2017 23:00 - 24:00 | 0 | 0 | 0 | 0 |
| 25.06.2017 00:00 - 01:00 | 0 | 0 | 0 | 0 |
| 25.06.2017 01:00 - 02:00 | 0 | 0 | 0 | 0 |
| 25.06.2017 02:00 - 03:00 | 0 | 0 | 0 | 0 |
| 25.06.2017 03:00 - 04:00 | 0 | 0 | 0 | 0 |
| 25.06.2017 04:00 - 05:00 | 0 | 0 | 0 | 0 |
| 25.06.2017 05:00 - 06:00 | 0 | 0 | 0 | 0 |
| 25.06.2017 06:00 - 07:00 | 0 | 0 | 0 | 0 |
| 25.06.2017 07:00 - 08:00 | 0 | 0 | 0 | 0 |
| 25.06.2017 08:00 - 09:00 | 0 | 0 | 0 | 0 |
| 25.06.2017 09:00 - 10:00 | 0 | 0 | 0 | 0 |
| 25.06.2017 10:00 - 11:00 | 0 | 0 | 0 | 0 |
| 25.06.2017 11:00 - 12:00 | 0 | 0 | 0 | 0 |
| 25.06.2017 12:00 - 13:00 | 0 | 0 | 0 | 0 |
| 25.06.2017 13:00 - 14:00 | 0 | 0 | 0 | 0 |
| 25.06.2017 14:00 - 15:00 | 0 | 0 | 0 | 0 |
| 25.06.2017 15:00 - 16:00 | 0 | 0 | 0 | 0 |
| 25.06.2017 16:00 - 17:00 | 0 | -350 | 0 | 0 |
| 25.06.2017 17:00 - 18:00 | 0 | -350 | 0 | 0 |
| 25.06.2017 18:00 - 19:00 | 0 | -350 | 0 | 0 |
| 25.06.2017 19:00 - 20:00 | 0 | -350 | 0 | 0 |
| 25.06.2017 20:00 - 21:00 | 0 | -350 | 0 | 0 |
| 25.06.2017 21:00 - 22:00 | 0 | -350 | 0 | 0 |
| 25.06.2017 22:00 - 23:00 | 0 | -350 | 0 | 0 |
| 25.06.2017 23:00 - 24:00 | 0 | -350 | 0 | 0 |
| 26.06.2017 00:00 - 01:00 | 0 | -350 | 0 | 0 |
| 26.06.2017 01:00 - 02:00 | 0 | -350 | 0 | 0 |
| 26.06.2017 02:00 - 03:00 | 0 | -350 | 0 | 0 |
| 26.06.2017 03:00 - 04:00 | 0 | -350 | 0 | 0 |
| 26.06.2017 04:00 - 05:00 | 0 | -350 | 0 | 0 |
| 26.06.2017 05:00 - 06:00 | 0 | -350 | 0 | 0 |
| 26.06.2017 06:00 - 07:00 | 0 | 0 | 0 | 0 |
| 26.06.2017 07:00 - 08:00 | 0 | 0 | 0 | 0 |
| 26.06.2017 08:00 - 09:00 | 0 | 0 | 0 | 0 |
| 26.06.2017 09:00 - 10:00 | 0 | 0 | 0 | 0 |
| 26.06.2017 10:00 - 11:00 | 0 | 0 | 0 | 0 |
| 26.06.2017 11:00 - 12:00 | 0 | 0 | 0 | 0 |
| 26.06.2017 12:00 - 13:00 | 0 | 0 | 0 | 0 |
| 26.06.2017 13:00 - 14:00 | 0 | 0 | 0 | 0 |
| 26.06.2017 14:00 - 15:00 | 0 | 0 | 0 | 0 |
| 26.06.2017 15:00 - 16:00 | 0 | 0 | 0 | 0 |
| 26.06.2017 16:00 - 17:00 | 0 | 0 | 0 | 0 |
| 26.06.2017 17:00 - 18:00 | 0 | 0 | 0 | 0 |
| 26.06.2017 18:00 - 19:00 | 0 | 0 | 0 | 0 |
| 26.06.2017 19:00 - 20:00 | 0 | 0 | 0 | 0 |
| 26.06.2017 20:00 - 21:00 | 0 | 0 | 0 | 0 |
| 26.06.2017 21:00 - 22:00 | 0 | 0 | 0 | 0 |
| 26.06.2017 22:00 - 23:00 | 0 | 0 | 0 | 0 |
| 26.06.2017 23:00 - 24:00 | 0 | 0 | 0 | 0 |
| 27.06.2017 00:00 - 01:00 | 0 | 0 | 0 | 0 |
| 27.06.2017 01:00 - 02:00 | 0 | 0 | 0 | 0 |
| 27.06.2017 02:00 - 03:00 | 0 | 0 | 0 | 0 |
| 27.06.2017 03:00 - 04:00 | 0 | 0 | 0 | 0 |
| 27.06.2017 04:00 - 05:00 | 0 | 0 | 0 | 0 |
| 27.06.2017 05:00 - 06:00 | 0 | 0 | 0 | 0 |
| 27.06.2017 06:00 - 07:00 | 0 | 0 | 0 | 0 |
| 27.06.2017 07:00 - 08:00 | 0 | 0 | 0 | 0 |
| 27.06.2017 08:00 - 09:00 | 0 | 0 | 0 | 0 |
| 27.06.2017 09:00 - 10:00 | 0 | 0 | 0 | 0 |
| 27.06.2017 10:00 - 11:00 | 0 | 0 | 0 | 0 |
| 27.06.2017 11:00 - 12:00 | 0 | 0 | 0 | 0 |
| 27.06.2017 12:00 - 13:00 | 0 | 0 | 0 | 0 |
| 27.06.2017 13:00 - 14:00 | 0 | 0 | 0 | 0 |
| 27.06.2017 14:00 - 15:00 | 0 | 0 | 0 | 0 |
| 27.06.2017 15:00 - 16:00 | 0 | 0 | 0 | 0 |
| 27.06.2017 16:00 - 17:00 | 0 | 0 | 0 | 0 |
| 27.06.2017 17:00 - 18:00 | 0 | 0 | 0 | 0 |
| 27.06.2017 18:00 - 19:00 | 0 | 0 | 0 | 0 |
| 27.06.2017 19:00 - 20:00 | 0 | 0 | 0 | 0 |
| 27.06.2017 20:00 - 21:00 | 0 | 0 | 0 | 0 |
| 27.06.2017 21:00 - 22:00 | 0 | 0 | 0 | 0 |
| 27.06.2017 22:00 - 23:00 | 0 | 0 | 0 | 0 |
| 27.06.2017 23:00 - 24:00 | 0 | 0 | 0 | 0 |
| 28.06.2017 00:00 - 01:00 | 0 | 0 | 0 | 0 |
| 28.06.2017 01:00 - 02:00 | 0 | 0 | 0 | 0 |
| 28.06.2017 02:00 - 03:00 | 0 | 0 | 0 | 0 |
| 28.06.2017 03:00 - 04:00 | 0 | 0 | 0 | 0 |
| 28.06.2017 04:00 - 05:00 | 0 | 0 | 0 | 0 |
| 28.06.2017 05:00 - 06:00 | 0 | 0 | 0 | 0 |
| 28.06.2017 06:00 - 07:00 | 0 | 0 | 0 | 0 |
| 28.06.2017 07:00 - 08:00 | 0 | 0 | 0 | 0 |
| 28.06.2017 08:00 - 09:00 | 0 | 0 | 0 | 0 |
| 28.06.2017 09:00 - 10:00 | 0 | 0 | 0 | 0 |
| 28.06.2017 10:00 - 11:00 | 0 | 0 | 0 | 0 |
| 28.06.2017 11:00 - 12:00 | 0 | 0 | 0 | 0 |
| 28.06.2017 12:00 - 13:00 | 0 | 0 | 0 | 0 |
| 28.06.2017 13:00 - 14:00 | 0 | 0 | 0 | 0 |
| 28.06.2017 14:00 - 15:00 | 0 | 0 | 0 | 0 |
| 28.06.2017 15:00 - 16:00 | 0 | 0 | 0 | 0 |
| 28.06.2017 16:00 - 17:00 | 400 | 0 | 0 | 0 |
| 28.06.2017 17:00 - 18:00 | 400 | 0 | 0 | 0 |
| 28.06.2017 18:00 - 19:00 | 400 | 0 | 0 | 0 |
| 28.06.2017 19:00 - 20:00 | 400 | 0 | 0 | 0 |
| 28.06.2017 20:00 - 21:00 | 400 | 0 | 0 | 0 |
| 28.06.2017 21:00 - 22:00 | 400 | 0 | 0 | 0 |
| 28.06.2017 22:00 - 23:00 | 400 | 0 | 0 | 0 |
| 28.06.2017 23:00 - 24:00 | 900 | 0 | 0 | 0 |
| 29.06.2017 00:00 - 01:00 | 900 | 0 | 0 | 0 |
| 29.06.2017 01:00 - 02:00 | 900 | 0 | 0 | 0 |
| 29.06.2017 02:00 - 03:00 | 900 | 0 | 0 | 0 |
| 29.06.2017 03:00 - 04:00 | 1900 | 0 | 0 | 0 |
| 29.06.2017 04:00 - 05:00 | 1900 | 0 | 0 | 0 |
| 29.06.2017 05:00 - 06:00 | 1900 | 0 | 0 | 0 |
| 29.06.2017 06:00 - 07:00 | 0 | 0 | 0 | 0 |
| 29.06.2017 07:00 - 08:00 | 0 | 0 | 0 | 0 |
| 29.06.2017 08:00 - 09:00 | 0 | 0 | 0 | 0 |
| 29.06.2017 09:00 - 10:00 | 0 | 0 | 0 | 0 |
| 29.06.2017 10:00 - 11:00 | 0 | 0 | 0 | 0 |
| 29.06.2017 11:00 - 12:00 | 0 | 0 | 0 | 0 |
| 29.06.2017 12:00 - 13:00 | 0 | 0 | 0 | 0 |
| 29.06.2017 13:00 - 14:00 | 0 | 0 | 0 | 0 |
| 29.06.2017 14:00 - 15:00 | 0 | 0 | 0 | 0 |
| 29.06.2017 15:00 - 16:00 | 0 | 0 | 0 | 0 |
| 29.06.2017 16:00 - 17:00 | 0 | 0 | 0 | 0 |
| 29.06.2017 17:00 - 18:00 | 0 | 0 | 0 | 0 |
| 29.06.2017 18:00 - 19:00 | 0 | 0 | 0 | 0 |
| 29.06.2017 19:00 - 20:00 | 0 | 0 | 0 | 0 |
| 29.06.2017 20:00 - 21:00 | 0 | 0 | 0 | 0 |
| 29.06.2017 21:00 - 22:00 | 0 | 0 | 0 | 0 |
| 29.06.2017 22:00 - 23:00 | 0 | 0 | 0 | 0 |
| 29.06.2017 23:00 - 24:00 | 0 | 0 | 0 | 0 |
| 30.06.2017 00:00 - 01:00 | 0 | 0 | 0 | 0 |
| 30.06.2017 01:00 - 02:00 | 500 | 0 | 0 | 0 |
| 30.06.2017 02:00 - 03:00 | 500 | 0 | 0 | 0 |
| 30.06.2017 03:00 - 04:00 | 500 | 0 | 0 | 0 |
| 30.06.2017 04:00 - 05:00 | 500 | 0 | 0 | 0 |
| 30.06.2017 05:00 - 06:00 | 500 | 0 | 0 | 0 |
| 30.06.2017 06:00 - 07:00 | 0 | 0 | 0 | 0 |
| 30.06.2017 07:00 - 08:00 | 0 | 0 | 0 | 0 |
| 30.06.2017 08:00 - 09:00 | 0 | 0 | 0 | 0 |
| 30.06.2017 09:00 - 10:00 | 0 | 0 | 0 | 0 |
| 30.06.2017 10:00 - 11:00 | 0 | 0 | 0 | 0 |
| 30.06.2017 11:00 - 12:00 | 0 | 0 | 0 | 0 |
| 30.06.2017 12:00 - 13:00 | 0 | 0 | 0 | 0 |
| 30.06.2017 13:00 - 14:00 | 0 | 0 | 0 | 0 |
| 30.06.2017 14:00 - 15:00 | 0 | 0 | 0 | 0 |
| 30.06.2017 15:00 - 16:00 | 0 | 0 | 0 | 0 |
| 30.06.2017 16:00 - 17:00 | 0 | 0 | 0 | 0 |
| 30.06.2017 17:00 - 18:00 | 0 | 0 | 0 | 0 |
| 30.06.2017 18:00 - 19:00 | 0 | 0 | 0 | 0 |
| 30.06.2017 19:00 - 20:00 | 0 | 0 | 0 | 0 |
| 30.06.2017 20:00 - 21:00 | 0 | 0 | 0 | 0 |
| 30.06.2017 21:00 - 22:00 | 0 | 0 | 0 | 0 |
| 30.06.2017 22:00 - 23:00 | 0 | 0 | 0 | 0 |
| 30.06.2017 23:00 - 24:00 | 0 | 0 | 0 | 0 |
| 01.07.2017 00:00 - 01:00 | 0 | 0 | 0 | 0 |
| 01.07.2017 01:00 - 02:00 | 0 | 0 | 0 | 0 |
| 01.07.2017 02:00 - 03:00 | 500 | 0 | 0 | 0 |
| 01.07.2017 03:00 - 04:00 | 500 | 0 | 0 | 0 |
| 01.07.2017 04:00 - 05:00 | 500 | 0 | 0 | 0 |
| 01.07.2017 05:00 - 06:00 | 500 | 0 | 0 | 0 |